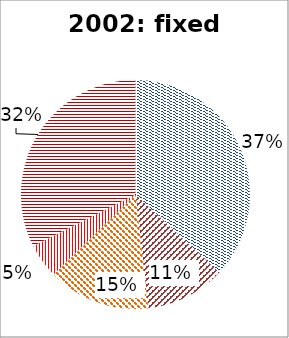
| Category | Series 0 |
|---|---|
| Fixed-line phone | 26188182064 |
| Cable Modem | 8005785001 |
| DSL | 10263601803 |
| FTTH/B | 3451427515 |
| OtherInternet/unidntf. | 23002689184 |